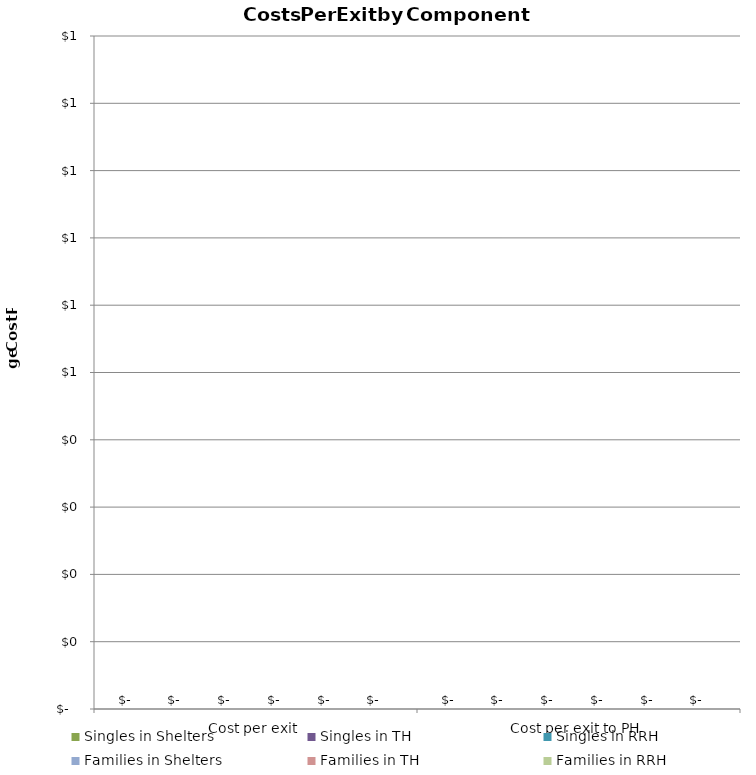
| Category | Singles in Shelters | Singles in TH | Singles in RRH | Families in Shelters | Families in TH | Families in RRH |
|---|---|---|---|---|---|---|
| Cost per exit | 0 | 0 | 0 | 0 | 0 | 0 |
| Cost per exit to PH | 0 | 0 | 0 | 0 | 0 | 0 |